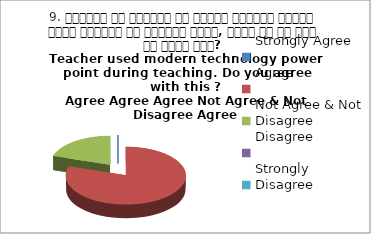
| Category | 9. शिक्षक ने शिक्षण के दौरान आधुनिक तकनीक पावर पॉइन्ट का प्रयोग किया, क्या आप इस बात से सहमत हैं? 
Teacher used modern technology power point during teaching. Do you agree with this ?
 Agree Agree Agree Not Agree & Not Disagree Agree |
|---|---|
| Strongly Agree | 0 |
| Agree | 4 |
| Not Agree & Not Disagree | 1 |
| Disagree | 0 |
| Strongly Disagree | 0 |